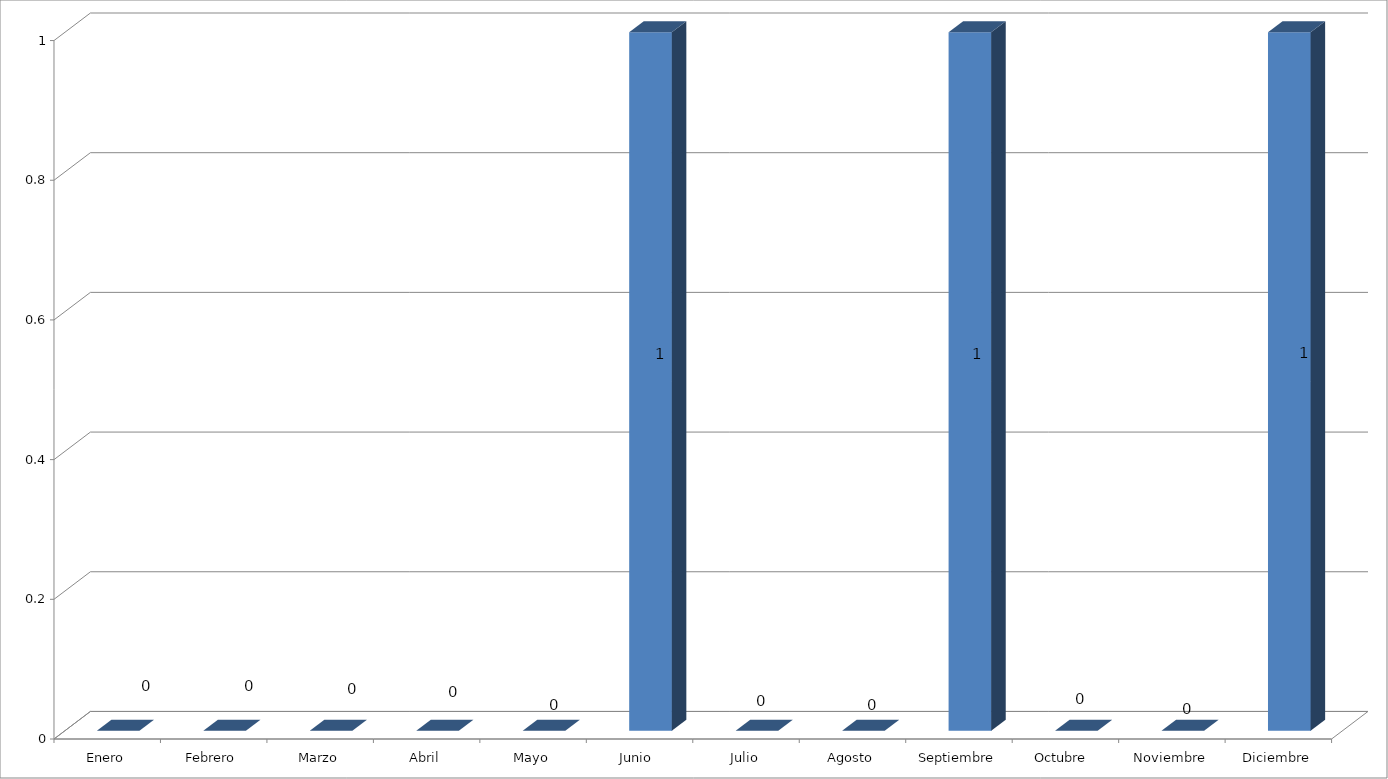
| Category | Series 0 |
|---|---|
| Enero | 0 |
| Febrero | 0 |
| Marzo | 0 |
| Abril | 0 |
| Mayo | 0 |
| Junio  | 1 |
| Julio | 0 |
| Agosto | 0 |
| Septiembre | 1 |
| Octubre  | 0 |
| Noviembre | 0 |
| Diciembre | 1 |